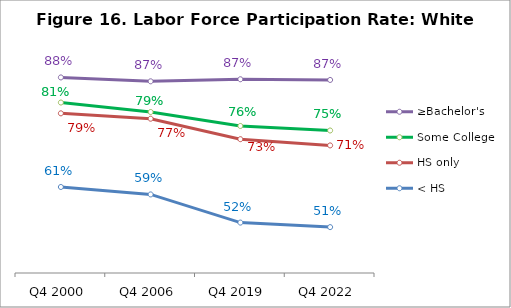
| Category | ≥Bachelor's | Some College | HS only | < HS |
|---|---|---|---|---|
| Q4 2000 | 0.875 | 0.814 | 0.788 | 0.609 |
| Q4 2006 | 0.866 | 0.791 | 0.775 | 0.591 |
| Q4 2019 | 0.871 | 0.757 | 0.725 | 0.522 |
| Q4 2022 | 0.869 | 0.746 | 0.71 | 0.511 |